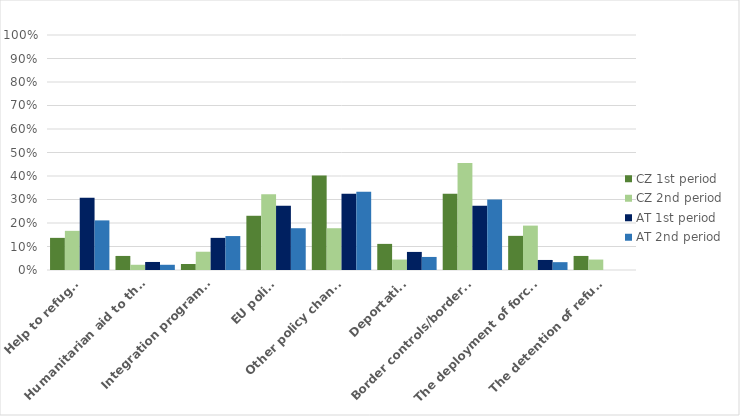
| Category | CZ 1st period | CZ 2nd period | AT 1st period | AT 2nd period |
|---|---|---|---|---|
| Help to refugees | 0.137 | 0.167 | 0.308 | 0.211 |
| Humanitarian aid to the Middle East | 0.06 | 0.022 | 0.034 | 0.022 |
| Integration programmes | 0.026 | 0.078 | 0.137 | 0.144 |
| EU policy | 0.231 | 0.322 | 0.274 | 0.178 |
| Other policy changes | 0.402 | 0.178 | 0.325 | 0.333 |
| Deportations | 0.111 | 0.044 | 0.077 | 0.056 |
| Border controls/border wall | 0.325 | 0.456 | 0.274 | 0.3 |
| The deployment of force/military | 0.145 | 0.189 | 0.043 | 0.033 |
| The detention of refugees | 0.06 | 0.044 | 0 | 0 |